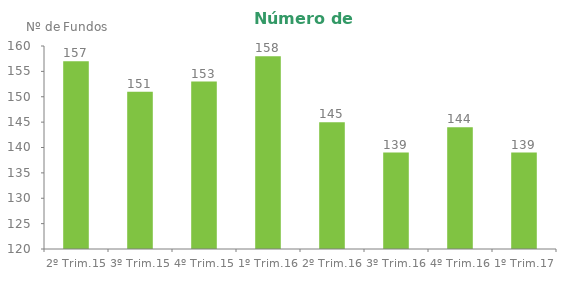
| Category | Series 0 |
|---|---|
| 2º Trim.15 | 157 |
| 3º Trim.15 | 151 |
| 4º Trim.15 | 153 |
| 1º Trim.16 | 158 |
| 2º Trim.16 | 145 |
| 3º Trim.16 | 139 |
| 4º Trim.16 | 144 |
| 1º Trim.17 | 139 |